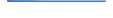
| Category | Series 0 |
|---|---|
| 0 | 99.431 |
| 1 | 73.469 |
| 2 | 66.647 |
| 3 | 55.672 |
| 4 | 53.512 |
| 5 | 56 |
| 6 | 54 |
| 7 | 49 |
| 8 | 62 |